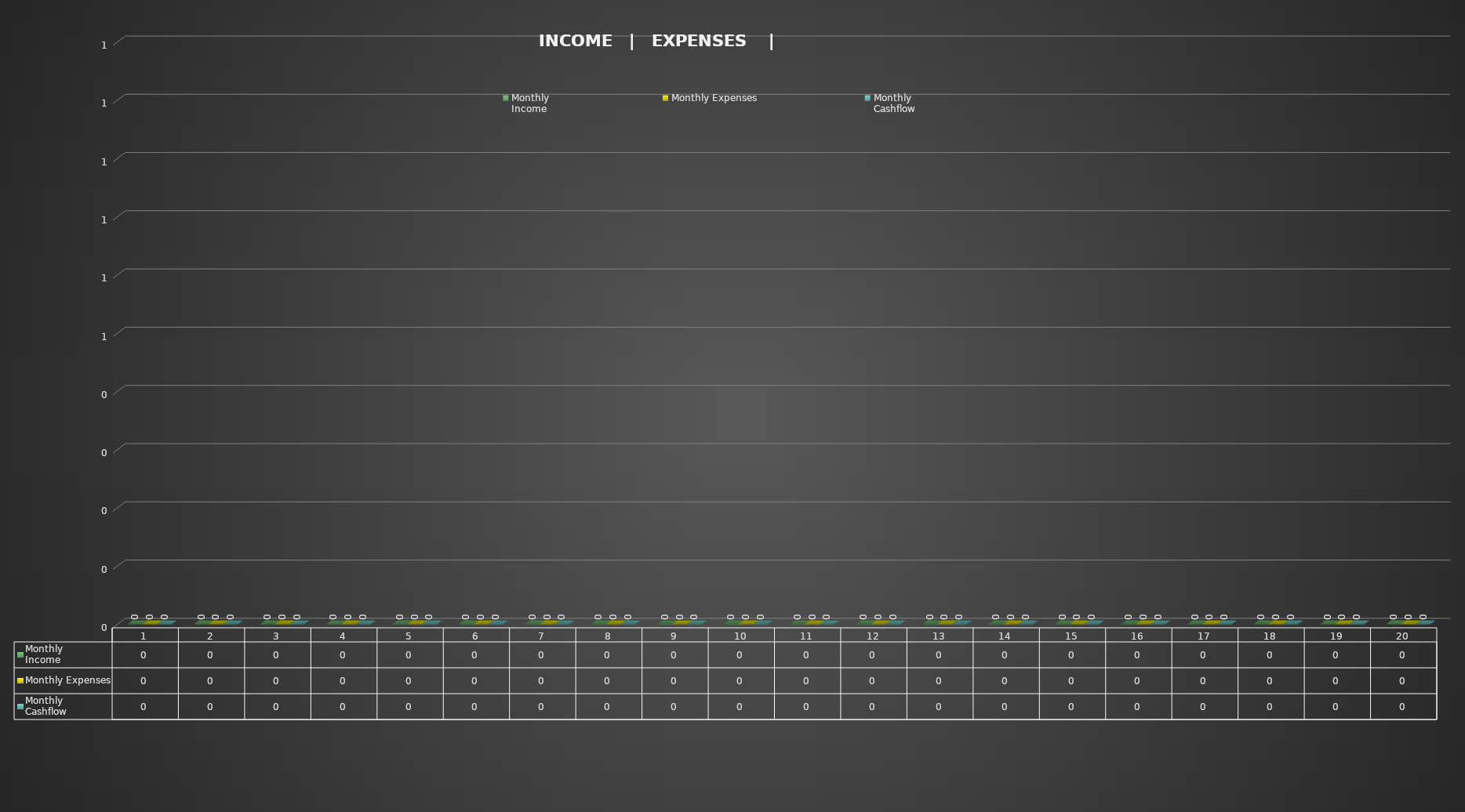
| Category | Monthly
Income | Monthly Expenses | Monthly
Cashflow |
|---|---|---|---|
| 0 | 0 | 0 | 0 |
| 1 | 0 | 0 | 0 |
| 2 | 0 | 0 | 0 |
| 3 | 0 | 0 | 0 |
| 4 | 0 | 0 | 0 |
| 5 | 0 | 0 | 0 |
| 6 | 0 | 0 | 0 |
| 7 | 0 | 0 | 0 |
| 8 | 0 | 0 | 0 |
| 9 | 0 | 0 | 0 |
| 10 | 0 | 0 | 0 |
| 11 | 0 | 0 | 0 |
| 12 | 0 | 0 | 0 |
| 13 | 0 | 0 | 0 |
| 14 | 0 | 0 | 0 |
| 15 | 0 | 0 | 0 |
| 16 | 0 | 0 | 0 |
| 17 | 0 | 0 | 0 |
| 18 | 0 | 0 | 0 |
| 19 | 0 | 0 | 0 |